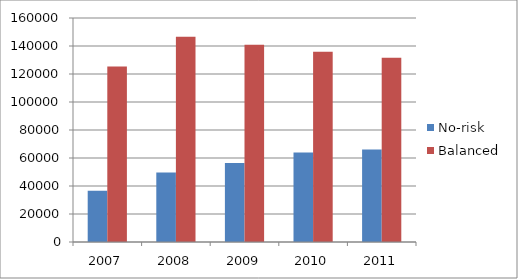
| Category | No-risk | Balanced |
|---|---|---|
| 2007.0 | 36557 | 125281 |
| 2008.0 | 49731 | 146529 |
| 2009.0 | 56486 | 140894 |
| 2010.0 | 63847 | 135852 |
| 2011.0 | 66058 | 131559 |